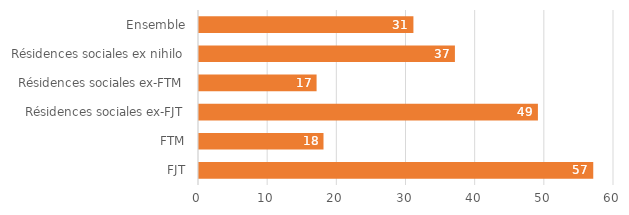
| Category | Taux de sortie |
|---|---|
| FJT | 57 |
| FTM | 18 |
| Résidences sociales ex-FJT | 49 |
| Résidences sociales ex-FTM | 17 |
| Résidences sociales ex nihilo | 37 |
| Ensemble | 31 |